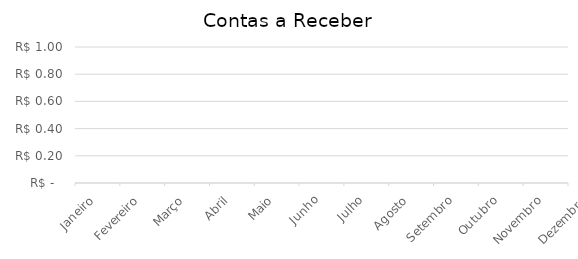
| Category | Contas a Receber |
|---|---|
| Janeiro | 0 |
| Fevereiro | 0 |
| Março | 0 |
| Abril | 0 |
| Maio | 0 |
| Junho | 0 |
| Julho | 0 |
| Agosto | 0 |
| Setembro | 0 |
| Outubro | 0 |
| Novembro | 0 |
| Dezembro | 0 |